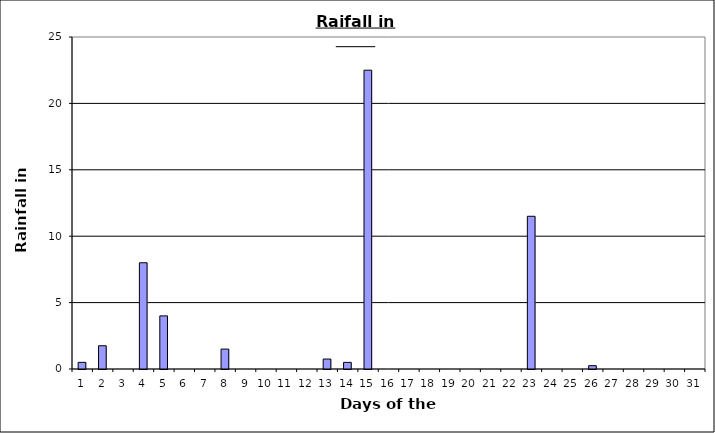
| Category | Series 0 |
|---|---|
| 0 | 0.5 |
| 1 | 1.75 |
| 2 | 0 |
| 3 | 8 |
| 4 | 4 |
| 5 | 0 |
| 6 | 0 |
| 7 | 1.5 |
| 8 | 0 |
| 9 | 0 |
| 10 | 0 |
| 11 | 0 |
| 12 | 0.75 |
| 13 | 0.5 |
| 14 | 22.5 |
| 15 | 0 |
| 16 | 0 |
| 17 | 0 |
| 18 | 0 |
| 19 | 0 |
| 20 | 0 |
| 21 | 0 |
| 22 | 11.5 |
| 23 | 0 |
| 24 | 0 |
| 25 | 0.25 |
| 26 | 0 |
| 27 | 0 |
| 28 | 0 |
| 29 | 0 |
| 30 | 0 |